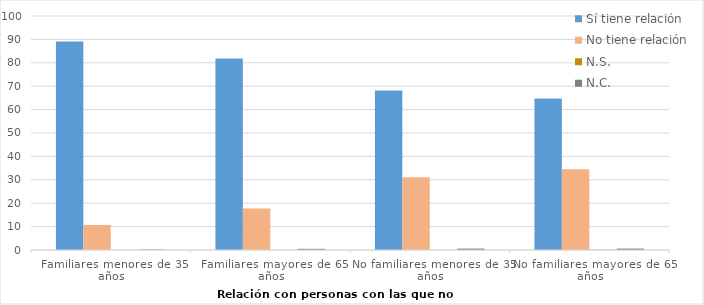
| Category | Sí tiene relación | No tiene relación  | N.S. | N.C. |
|---|---|---|---|---|
| Familiares menores de 35 años | 89.1 | 10.7 | 0 | 0.2 |
| Familiares mayores de 65 años | 81.8 | 17.7 | 0 | 0.5 |
| No familiares menores de 35 años | 68.2 | 31.1 | 0 | 0.6 |
| No familiares mayores de 65 años | 64.7 | 34.5 | 0.1 | 0.6 |